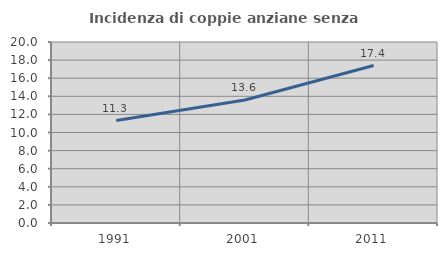
| Category | Incidenza di coppie anziane senza figli  |
|---|---|
| 1991.0 | 11.316 |
| 2001.0 | 13.593 |
| 2011.0 | 17.402 |